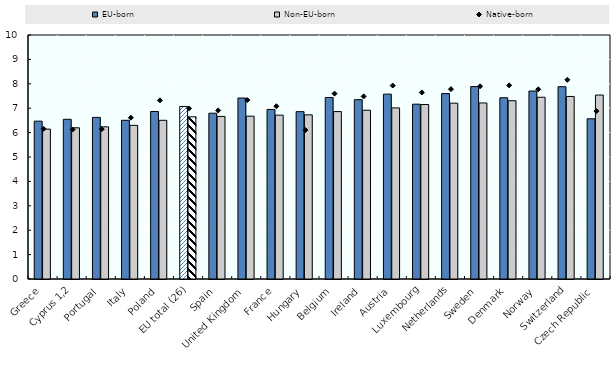
| Category | EU-born | Non-EU-born |
|---|---|---|
| Greece | 6.47 | 6.143 |
| Cyprus 1,2 | 6.546 | 6.197 |
| Portugal | 6.623 | 6.236 |
| Italy | 6.504 | 6.297 |
| Poland | 6.865 | 6.504 |
| EU total (26) | 7.07 | 6.646 |
| Spain | 6.796 | 6.663 |
| United Kingdom | 7.417 | 6.672 |
| France | 6.95 | 6.716 |
| Hungary | 6.859 | 6.727 |
| Belgium | 7.439 | 6.861 |
| Ireland | 7.349 | 6.917 |
| Austria | 7.577 | 7.012 |
| Luxembourg | 7.165 | 7.151 |
| Netherlands | 7.598 | 7.206 |
| Sweden | 7.886 | 7.215 |
| Denmark | 7.429 | 7.306 |
| Norway | 7.704 | 7.448 |
| Switzerland | 7.881 | 7.482 |
| Czech Republic | 6.567 | 7.54 |